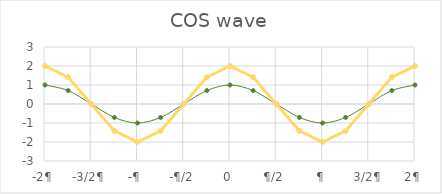
| Category | Series 1 | 2 |
|---|---|---|
| -2¶ | 1 | 2 |
|  | 0.707 | 1.414 |
| -3/2¶ | 0 | 0 |
|  | -0.707 | -1.414 |
| -¶ | -1 | -2 |
|  | -0.707 | -1.414 |
| -¶/2 | 0 | 0 |
|  | 0.707 | 1.414 |
| 0 | 1 | 2 |
|  | 0.707 | 1.414 |
| ¶/2 | 0 | 0 |
|  | -0.707 | -1.414 |
| ¶ | -1 | -2 |
|  | -0.707 | -1.414 |
| 3/2¶ | 0 | 0 |
|  | 0.707 | 1.414 |
| 2¶ | 1 | 2 |